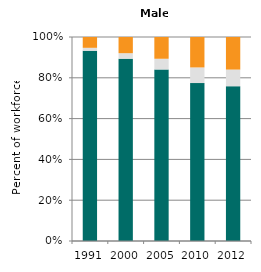
| Category | Agriculture | Industry | Services |
|---|---|---|---|
| 1991.0 | 93.24 | 1.459 | 5.301 |
| 2000.0 | 89.396 | 2.67 | 7.934 |
| 2005.0 | 84.086 | 5.246 | 10.668 |
| 2010.0 | 77.421 | 7.665 | 14.915 |
| 2012.0 | 75.871 | 8.162 | 15.968 |